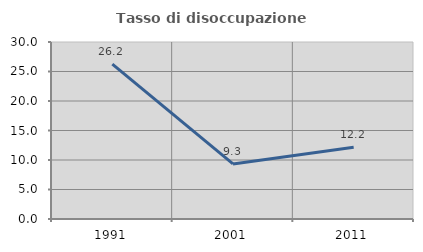
| Category | Tasso di disoccupazione giovanile  |
|---|---|
| 1991.0 | 26.241 |
| 2001.0 | 9.333 |
| 2011.0 | 12.162 |